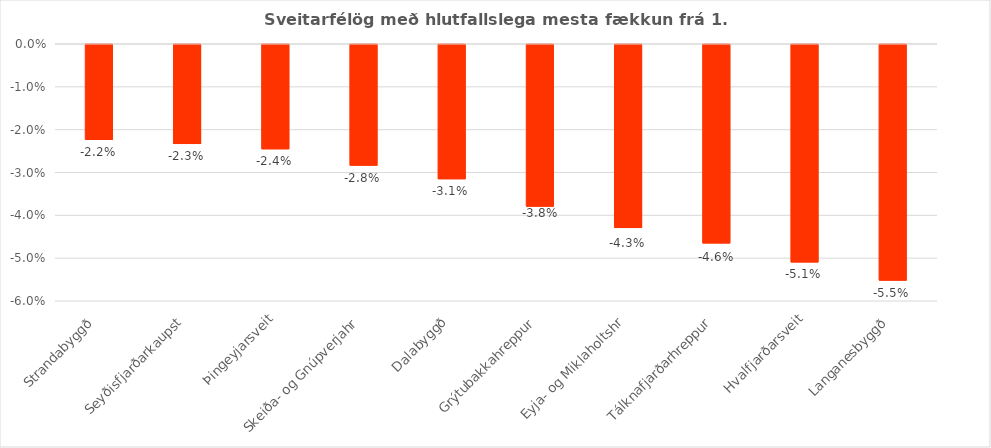
| Category | Breytingar |
|---|---|
| Strandabyggð | -0.022 |
| Seyðisfjarðarkaupst | -0.023 |
| Þingeyjarsveit | -0.024 |
| Skeiða- og Gnúpverjahr | -0.028 |
| Dalabyggð | -0.031 |
| Grýtubakkahreppur | -0.038 |
| Eyja- og Miklaholtshr | -0.043 |
| Tálknafjarðarhreppur | -0.046 |
| Hvalfjarðarsveit | -0.051 |
| Langanesbyggð | -0.055 |